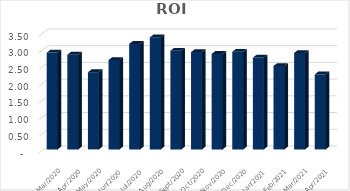
| Category |  ROI  |
|---|---|
| 2021-04-30 | 2.246 |
| 2021-03-31 | 2.885 |
| 2021-02-28 | 2.497 |
| 2021-01-31 | 2.747 |
| 2020-12-31 | 2.923 |
| 2020-11-30 | 2.858 |
| 2020-10-31 | 2.911 |
| 2020-09-30 | 2.954 |
| 2020-08-31 | 3.352 |
| 2020-07-31 | 3.156 |
| 2020-06-30 | 2.673 |
| 2020-05-31 | 2.311 |
| 2020-04-30 | 2.835 |
| 2020-03-31 | 2.896 |